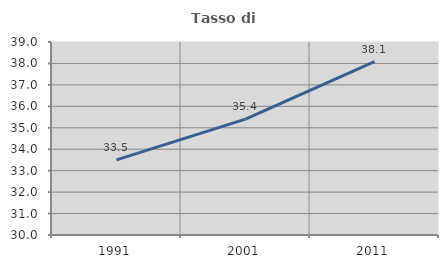
| Category | Tasso di occupazione   |
|---|---|
| 1991.0 | 33.503 |
| 2001.0 | 35.404 |
| 2011.0 | 38.085 |